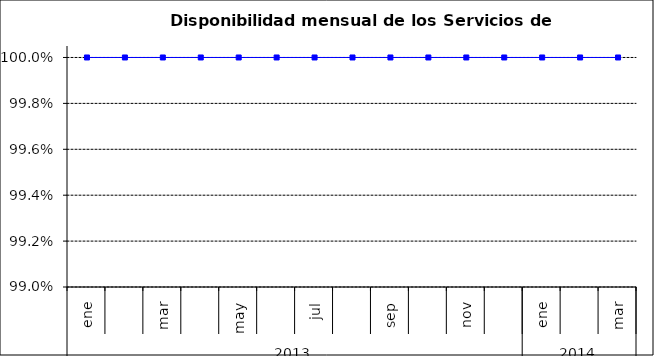
| Category | SCL |
|---|---|
| 0 | 1 |
| 1 | 1 |
| 2 | 1 |
| 3 | 1 |
| 4 | 1 |
| 5 | 1 |
| 6 | 1 |
| 7 | 1 |
| 8 | 1 |
| 9 | 1 |
| 10 | 1 |
| 11 | 1 |
| 12 | 1 |
| 13 | 1 |
| 14 | 1 |